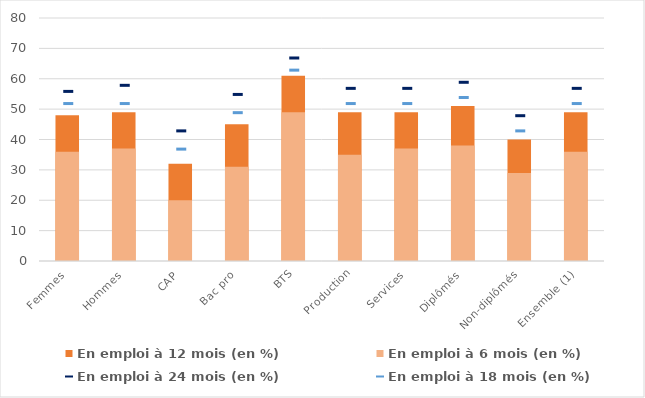
| Category | En emploi à 12 mois (en %) | En emploi à 6 mois (en %) |
|---|---|---|
| Femmes | 48 | 36 |
| Hommes | 49 | 37 |
| CAP | 32 | 20 |
| Bac pro | 45 | 31 |
| BTS | 61 | 49 |
| Production | 49 | 35 |
| Services | 49 | 37 |
| Diplômés | 51 | 38 |
| Non-diplômés | 40 | 29 |
| Ensemble (1) | 49 | 36 |